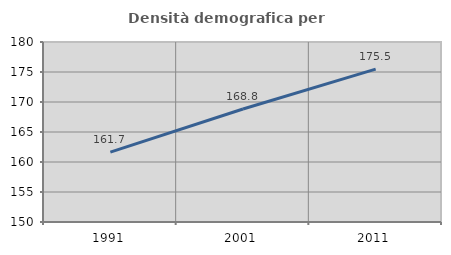
| Category | Densità demografica |
|---|---|
| 1991.0 | 161.65 |
| 2001.0 | 168.838 |
| 2011.0 | 175.469 |